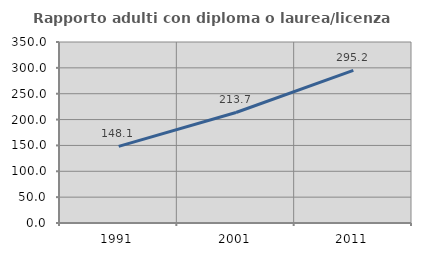
| Category | Rapporto adulti con diploma o laurea/licenza media  |
|---|---|
| 1991.0 | 148.11 |
| 2001.0 | 213.682 |
| 2011.0 | 295.184 |